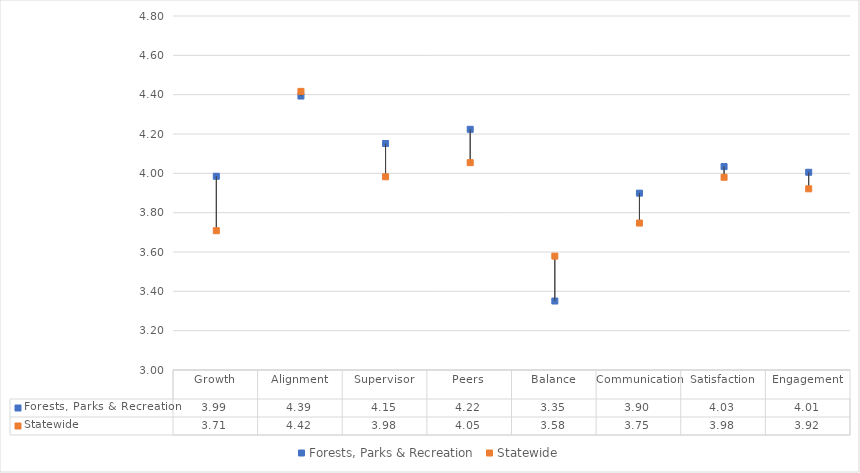
| Category | Forests, Parks & Recreation | Statewide |
|---|---|---|
| Growth | 3.985 | 3.708 |
| Alignment | 4.393 | 4.417 |
| Supervisor | 4.152 | 3.983 |
| Peers | 4.224 | 4.054 |
| Balance | 3.351 | 3.579 |
| Communication | 3.899 | 3.747 |
| Satisfaction | 4.034 | 3.98 |
| Engagement | 4.005 | 3.921 |